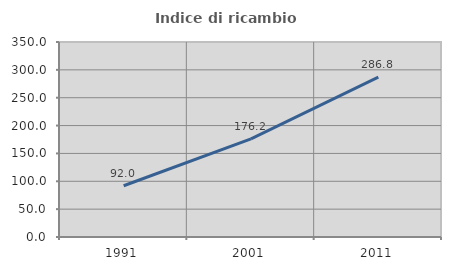
| Category | Indice di ricambio occupazionale  |
|---|---|
| 1991.0 | 92.035 |
| 2001.0 | 176.19 |
| 2011.0 | 286.792 |